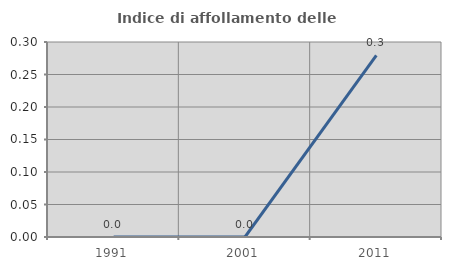
| Category | Indice di affollamento delle abitazioni  |
|---|---|
| 1991.0 | 0 |
| 2001.0 | 0 |
| 2011.0 | 0.279 |